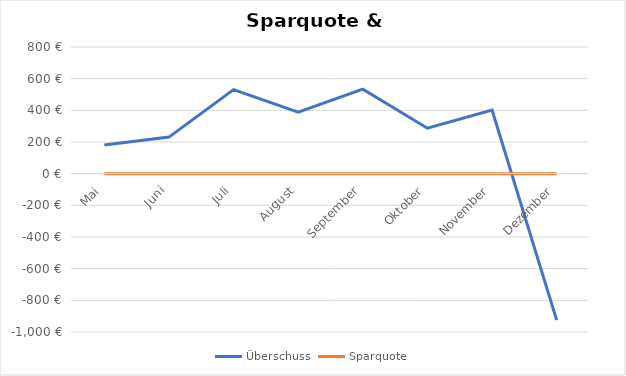
| Category | Überschuss | Sparquote |
|---|---|---|
| Mai | 181.04 | 0.066 |
| Juni | 231.04 | 0.084 |
| Juli | 531.04 | 0.193 |
| August | 389.04 | 0.141 |
| September | 534.04 | 0.194 |
| Oktober | 287.04 | 0.104 |
| November | 401.04 | 0.146 |
| Dezember | -924.96 | -0.336 |